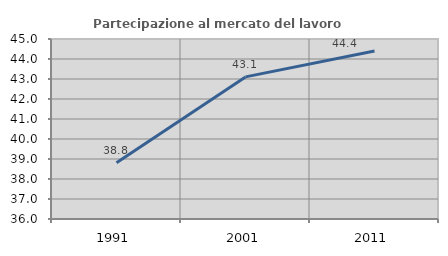
| Category | Partecipazione al mercato del lavoro  femminile |
|---|---|
| 1991.0 | 38.814 |
| 2001.0 | 43.105 |
| 2011.0 | 44.402 |